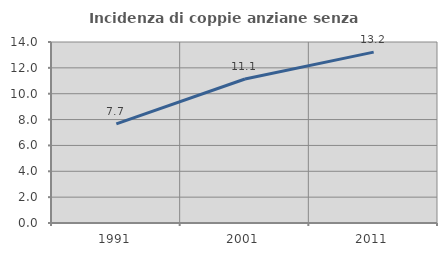
| Category | Incidenza di coppie anziane senza figli  |
|---|---|
| 1991.0 | 7.673 |
| 2001.0 | 11.138 |
| 2011.0 | 13.217 |